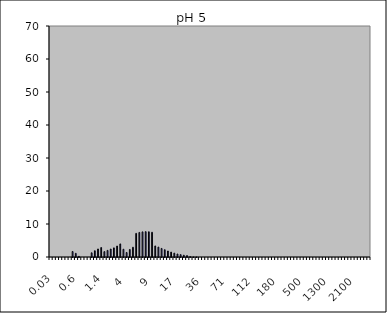
| Category | Maghemite pH 5 1Nb |
|---|---|
| 0.03 | 0 |
| 0.04 | 0 |
| 0.07 | 0 |
| 0.1 | 0 |
| 0.2 | 0 |
| 0.3 | 0 |
| 0.4 | 0 |
| 0.5 | 1.669 |
| 0.6 | 1.117 |
| 0.7 | 0.191 |
| 0.8 | 0 |
| 0.9 | 0 |
| 1.0 | 0 |
| 1.1 | 1.277 |
| 1.2 | 1.896 |
| 1.3 | 2.43 |
| 1.4 | 2.873 |
| 1.6 | 1.629 |
| 1.8 | 2.003 |
| 2.0 | 2.406 |
| 2.2 | 2.766 |
| 2.4 | 3.326 |
| 2.6 | 3.962 |
| 3.0 | 2.351 |
| 4.0 | 1.371 |
| 5.0 | 2.284 |
| 6.0 | 2.958 |
| 6.5 | 7.163 |
| 7.0 | 7.451 |
| 7.5 | 7.616 |
| 8.0 | 7.684 |
| 8.5 | 7.648 |
| 9.0 | 7.499 |
| 10.0 | 3.351 |
| 11.0 | 2.998 |
| 12.0 | 2.596 |
| 13.0 | 2.211 |
| 14.0 | 1.816 |
| 15.0 | 1.483 |
| 16.0 | 1.171 |
| 17.0 | 0.912 |
| 18.0 | 0.726 |
| 19.0 | 0.546 |
| 20.0 | 0.431 |
| 22.0 | 0.135 |
| 25.0 | 0.036 |
| 28.0 | 0.016 |
| 32.0 | 0 |
| 36.0 | 0 |
| 38.0 | 0 |
| 40.0 | 0 |
| 45.0 | 0 |
| 50.0 | 0 |
| 53.0 | 0 |
| 56.0 | 0 |
| 63.0 | 0 |
| 71.0 | 0 |
| 75.0 | 0 |
| 80.0 | 0 |
| 85.0 | 0 |
| 90.0 | 0 |
| 95.0 | 0 |
| 100.0 | 0 |
| 106.0 | 0 |
| 112.0 | 0 |
| 125.0 | 0 |
| 130.0 | 0 |
| 140.0 | 0 |
| 145.0 | 0 |
| 150.0 | 0 |
| 160.0 | 0 |
| 170.0 | 0 |
| 180.0 | 0 |
| 190.0 | 0 |
| 200.0 | 0 |
| 212.0 | 0 |
| 242.0 | 0 |
| 250.0 | 0 |
| 300.0 | 0 |
| 400.0 | 0 |
| 500.0 | 0 |
| 600.0 | 0 |
| 700.0 | 0 |
| 800.0 | 0 |
| 900.0 | 0 |
| 1000.0 | 0 |
| 1100.0 | 0 |
| 1200.0 | 0 |
| 1300.0 | 0 |
| 1400.0 | 0 |
| 1500.0 | 0 |
| 1600.0 | 0 |
| 1700.0 | 0 |
| 1800.0 | 0 |
| 1900.0 | 0 |
| 2000.0 | 0 |
| 2100.0 | 0 |
| 2200.0 | 0 |
| 2300.0 | 0 |
| 2400.0 | 0 |
| 2500.0 | 0 |